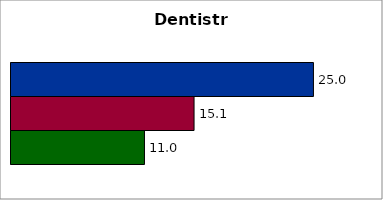
| Category | 50 states and D.C. | SREB states | State |
|---|---|---|---|
| 0 | 24.995 | 15.128 | 11.029 |